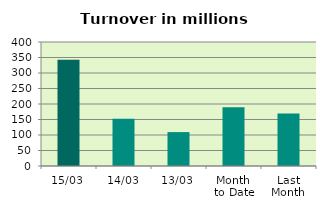
| Category | Series 0 |
|---|---|
| 15/03 | 342.561 |
| 14/03 | 152.775 |
| 13/03 | 109.406 |
| Month 
to Date | 189.134 |
| Last
Month | 168.971 |